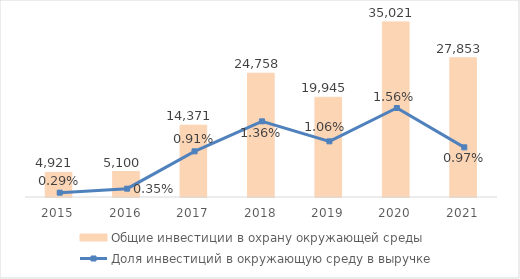
| Category | Общие инвестиции в охрану окружающей среды |
|---|---|
| 2015.0 | 4921 |
| 2016.0 | 5100 |
| 2017.0 | 14371 |
| 2018.0 | 24758 |
| 2019.0 | 19945.402 |
| 2020.0 | 35021.267 |
| 2021.0 | 27853.037 |